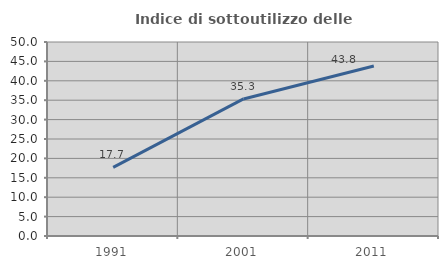
| Category | Indice di sottoutilizzo delle abitazioni  |
|---|---|
| 1991.0 | 17.68 |
| 2001.0 | 35.329 |
| 2011.0 | 43.796 |